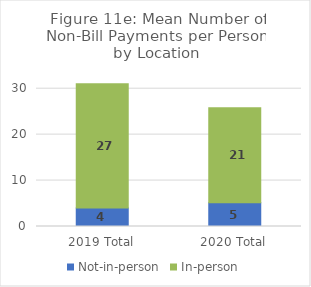
| Category | Not-in-person | In-person |
|---|---|---|
| 2019 Total | 4.006 | 27.053 |
| 2020 Total | 5.143 | 20.698 |